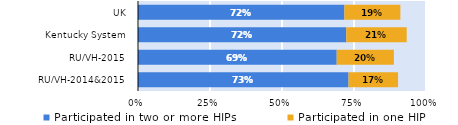
| Category | Participated in two or more HIPs | Participated in one HIP |
|---|---|---|
| RU/VH-2014&2015 | 0.731 | 0.172 |
| RU/VH-2015 | 0.69 | 0.198 |
| Kentucky System | 0.723 | 0.21 |
| UK | 0.717 | 0.194 |